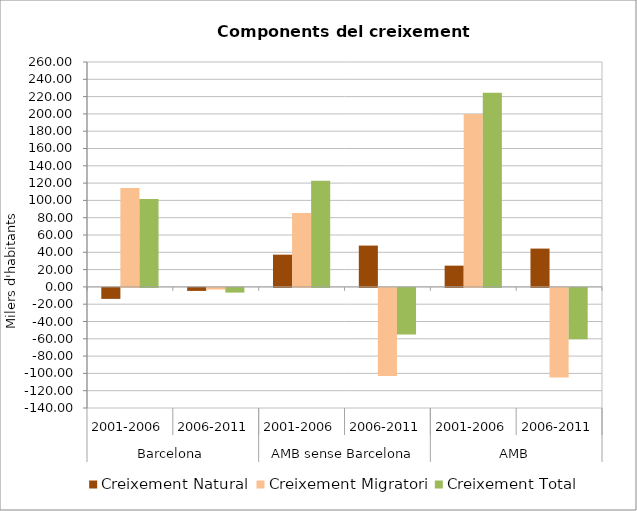
| Category | Creixement Natural | Creixement Migratori | Creixement Total |
|---|---|---|---|
| 0 | -12.693 | 114.411 | 101.718 |
| 1 | -3.485 | -1.926 | -5.411 |
| 2 | 37.262 | 85.538 | 122.8 |
| 3 | 47.776 | -101.76 | -53.984 |
| 4 | 24.569 | 199.949 | 224.518 |
| 5 | 44.291 | -103.686 | -59.395 |